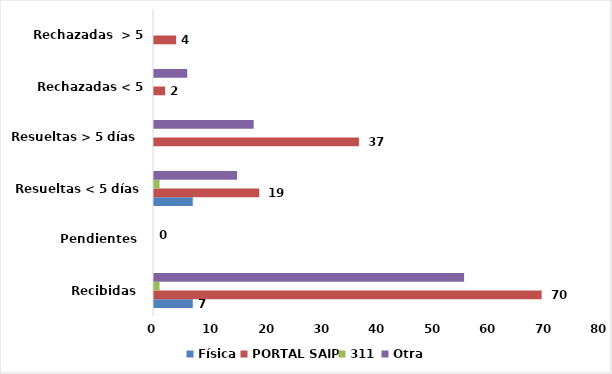
| Category | Física | PORTAL SAIP | 311 | Otra |
|---|---|---|---|---|
| Recibidas  | 7 | 70 | 1 | 56 |
| Pendientes  | 0 | 0 | 0 | 0 |
| Resueltas < 5 días | 7 | 19 | 1 | 15 |
| Resueltas > 5 días  | 0 | 37 | 0 | 18 |
| Rechazadas < 5 días  | 0 | 2 | 0 | 6 |
| Rechazadas  > 5 días | 0 | 4 | 0 | 0 |